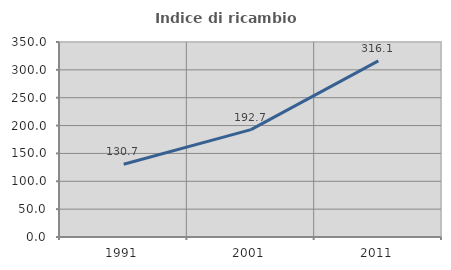
| Category | Indice di ricambio occupazionale  |
|---|---|
| 1991.0 | 130.657 |
| 2001.0 | 192.672 |
| 2011.0 | 316.062 |